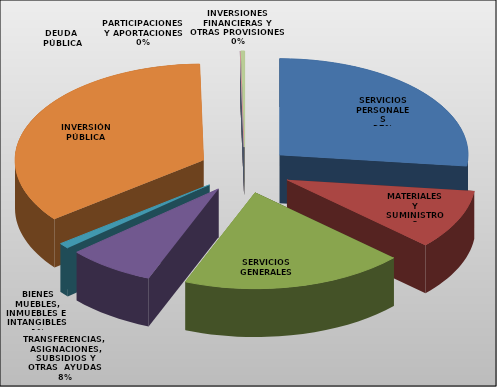
| Category | Series 0 |
|---|---|
| SERVICIOS PERSONALES | 9418960 |
| MATERIALES Y SUMINISTROS | 3508218 |
| SERVICIOS GENERALES | 6725962 |
| TRANSFERENCIAS, ASIGNACIONES, SUBSIDIOS Y OTRAS  AYUDAS | 2631187 |
| BIENES MUEBLES, INMUEBLES E  INTANGIBLES  | 335000 |
| INVERSIÓN PÚBLICA | 12334770 |
| INVERSIONES FINANCIERAS Y OTRAS PROVISIONES | 0 |
| PARTICIPACIONES Y APORTACIONES | 0 |
| DEUDA  PÚBLICA | 114860 |